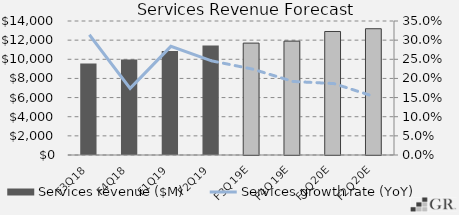
| Category | Services revenue ($M) |
|---|---|
|  F3Q18  | 9548 |
|  F4Q18  | 9981 |
|  F1Q19  | 10875 |
|  F2Q19  | 11450 |
|  F3Q19E  | 11691.225 |
|  F4Q19E  | 11898.043 |
|  F1Q20E  | 12903.864 |
|  F2Q20E  | 13193.318 |